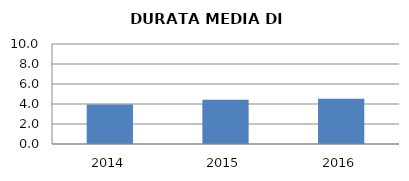
| Category | 2014 2015 2016 |
|---|---|
| 2014.0 | 3.959 |
| 2015.0 | 4.414 |
| 2016.0 | 4.523 |